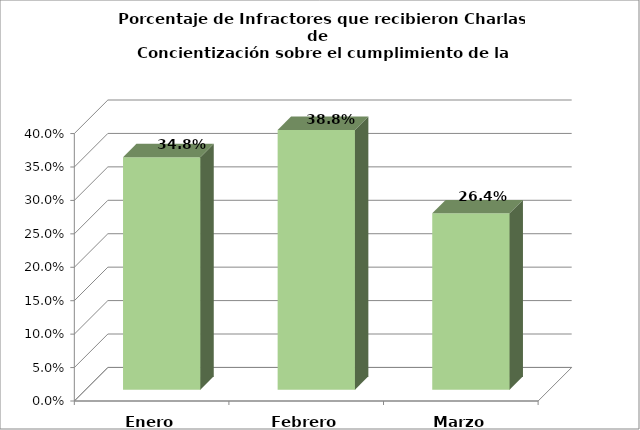
| Category | Series 0 |
|---|---|
| Enero | 0.348 |
| Febrero | 0.388 |
| Marzo | 0.264 |